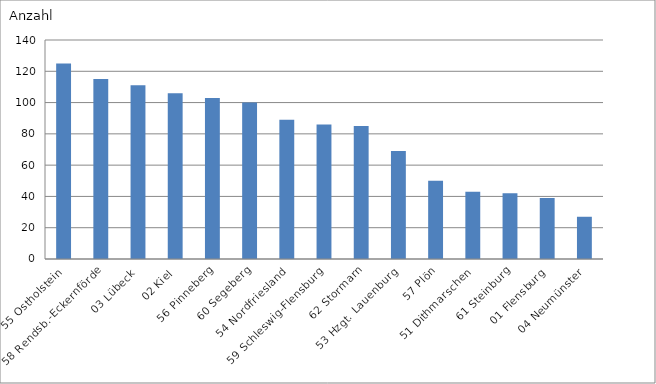
| Category | 55 Ostholstein |
|---|---|
| 55 Ostholstein | 125 |
| 58 Rendsb.-Eckernförde | 115 |
| 03 Lübeck | 111 |
| 02 Kiel | 106 |
| 56 Pinneberg | 103 |
| 60 Segeberg | 100 |
| 54 Nordfriesland | 89 |
| 59 Schleswig-Flensburg | 86 |
| 62 Stormarn | 85 |
| 53 Hzgt. Lauenburg | 69 |
| 57 Plön | 50 |
| 51 Dithmarschen | 43 |
| 61 Steinburg | 42 |
| 01 Flensburg | 39 |
| 04 Neumünster | 27 |